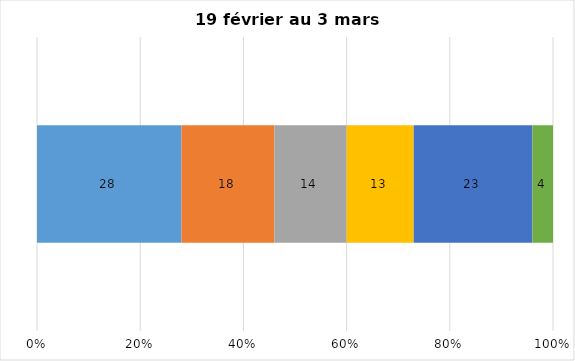
| Category | Plusieurs fois par jour | Une fois par jour | Quelques fois par semaine   | Une fois par semaine ou moins   |  Jamais   |  Je n’utilise pas les médias sociaux |
|---|---|---|---|---|---|---|
| 0 | 28 | 18 | 14 | 13 | 23 | 4 |